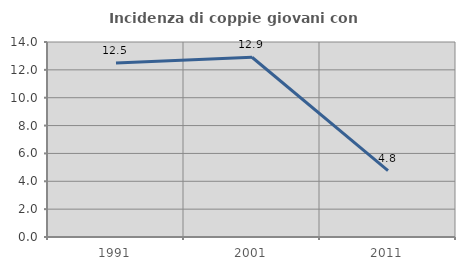
| Category | Incidenza di coppie giovani con figli |
|---|---|
| 1991.0 | 12.5 |
| 2001.0 | 12.903 |
| 2011.0 | 4.762 |